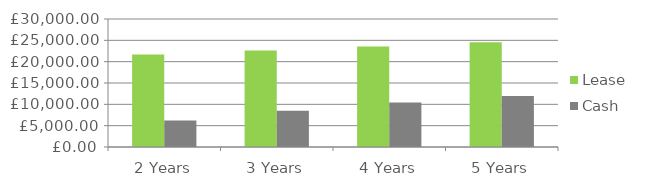
| Category | Lease | Cash |
|---|---|---|
| 2 Years | 21696.332 | 6224.4 |
| 3 Years | 22626.506 | 8524.008 |
| 4 Years | 23582.361 | 10409.687 |
| 5 Years | 24563.754 | 11955.943 |